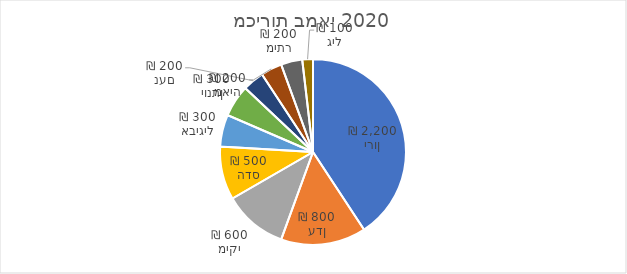
| Category | מכירות במאי 2020 |
|---|---|
| ירון | 2200 |
| עדן | 800 |
| מיקי | 600 |
| הדס | 500 |
| אביגיל | 300 |
| יונתן | 300 |
| נעם | 200 |
| מאיה | 200 |
| מיתר | 200 |
| גיל | 100 |